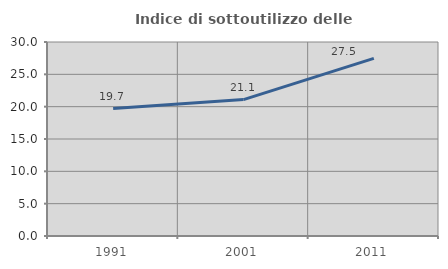
| Category | Indice di sottoutilizzo delle abitazioni  |
|---|---|
| 1991.0 | 19.714 |
| 2001.0 | 21.09 |
| 2011.0 | 27.472 |